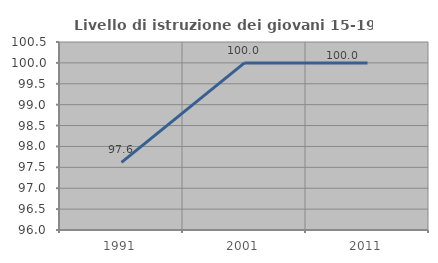
| Category | Livello di istruzione dei giovani 15-19 anni |
|---|---|
| 1991.0 | 97.619 |
| 2001.0 | 100 |
| 2011.0 | 100 |